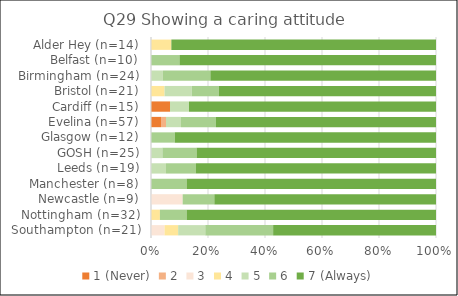
| Category | 1 (Never) | 2 | 3 | 4 | 5 | 6 | 7 (Always) |
|---|---|---|---|---|---|---|---|
| Southampton (n=21) | 0 | 0 | 1 | 1 | 2 | 5 | 12 |
| Nottingham (n=32) | 0 | 0 | 0 | 1 | 0 | 3 | 28 |
| Newcastle (n=9) | 0 | 0 | 1 | 0 | 0 | 1 | 7 |
| Manchester (n=8) | 0 | 0 | 0 | 0 | 0 | 1 | 7 |
| Leeds (n=19) | 0 | 0 | 0 | 0 | 1 | 2 | 16 |
| GOSH (n=25) | 0 | 0 | 0 | 0 | 1 | 3 | 21 |
| Glasgow (n=12) | 0 | 0 | 0 | 0 | 0 | 1 | 11 |
| Evelina (n=57) | 2 | 1 | 0 | 0 | 3 | 7 | 44 |
| Cardiff (n=15) | 1 | 0 | 0 | 0 | 1 | 0 | 13 |
| Bristol (n=21) | 0 | 0 | 0 | 1 | 2 | 2 | 16 |
| Birmingham (n=24) | 0 | 0 | 0 | 0 | 1 | 4 | 19 |
| Belfast (n=10) | 0 | 0 | 0 | 0 | 0 | 1 | 9 |
| Alder Hey (n=14) | 0 | 0 | 0 | 1 | 0 | 0 | 13 |